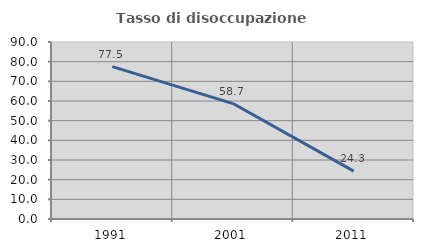
| Category | Tasso di disoccupazione giovanile  |
|---|---|
| 1991.0 | 77.5 |
| 2001.0 | 58.696 |
| 2011.0 | 24.324 |